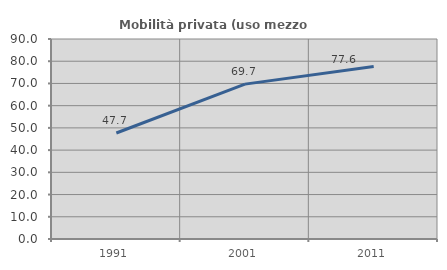
| Category | Mobilità privata (uso mezzo privato) |
|---|---|
| 1991.0 | 47.692 |
| 2001.0 | 69.697 |
| 2011.0 | 77.647 |